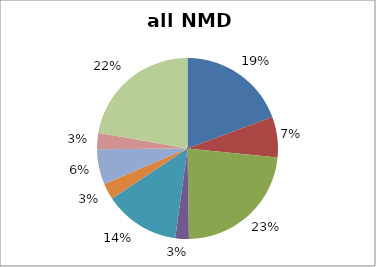
| Category | Series 0 |
|---|---|
| protein metabolism | 40 |
| misc | 15 |
| RNA | 48 |
| DNA | 5 |
| metabolism | 28 |
| signalling | 6 |
| cell division and development | 13 |
| stress | 6 |
| not assigned | 46 |